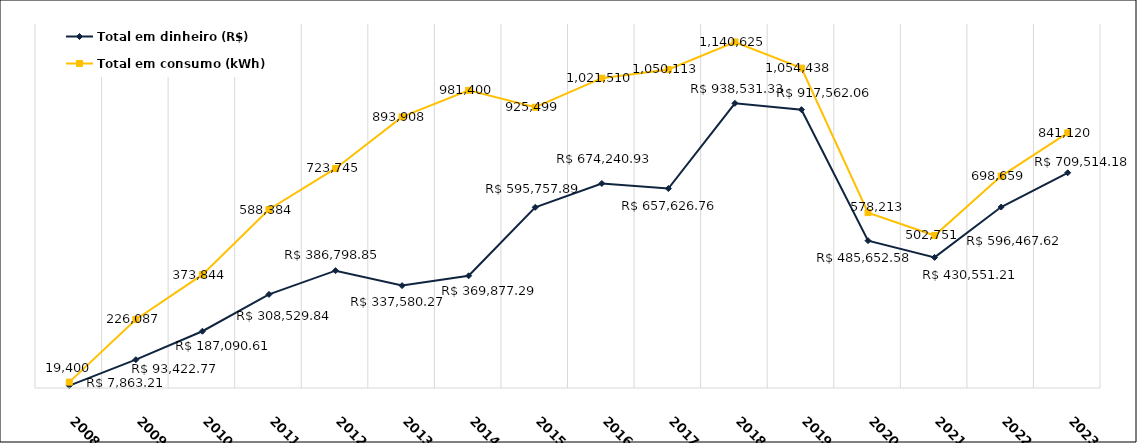
| Category | Total em dinheiro (R$) | Total em consumo (kWh) |
|---|---|---|
| 2008.0 | 7863.21 | 19400 |
| 2009.0 | 93422.77 | 226087 |
| 2010.0 | 187090.61 | 373844 |
| 2011.0 | 308529.84 | 588384 |
| 2012.0 | 386798.85 | 723745 |
| 2013.0 | 337580.27 | 893908 |
| 2014.0 | 369877.29 | 981400 |
| 2015.0 | 595757.89 | 925499 |
| 2016.0 | 674240.93 | 1021510 |
| 2017.0 | 657626.76 | 1050113 |
| 2018.0 | 938531.33 | 1140625 |
| 2019.0 | 917562.06 | 1054438 |
| 2020.0 | 485652.58 | 578213 |
| 2021.0 | 430551.21 | 502751 |
| 2022.0 | 596467.62 | 698659 |
| 2023.0 | 709514.18 | 841120 |